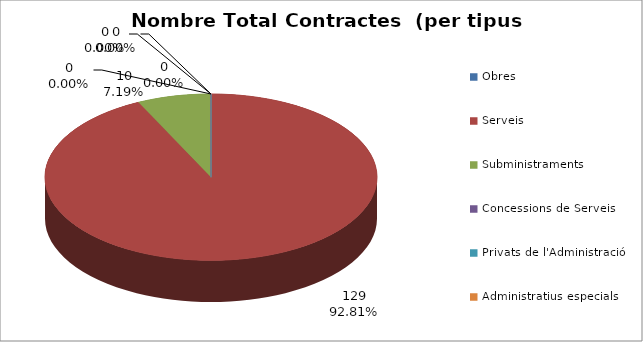
| Category | Nombre Total Contractes |
|---|---|
| Obres | 0 |
| Serveis | 129 |
| Subministraments | 10 |
| Concessions de Serveis | 0 |
| Privats de l'Administració | 0 |
| Administratius especials | 0 |